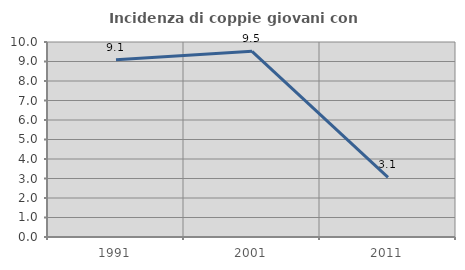
| Category | Incidenza di coppie giovani con figli |
|---|---|
| 1991.0 | 9.091 |
| 2001.0 | 9.524 |
| 2011.0 | 3.061 |